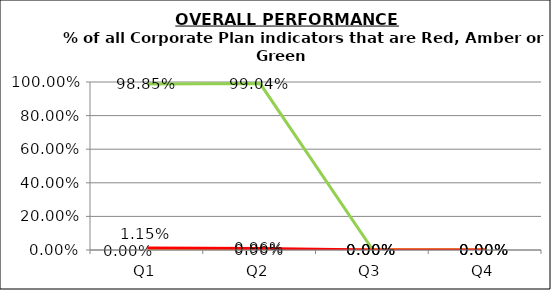
| Category | Green | Amber | Red |
|---|---|---|---|
| Q1 | 0.989 | 0 | 0.011 |
| Q2 | 0.99 | 0 | 0.01 |
| Q3 | 0 | 0 | 0 |
| Q4 | 0 | 0 | 0 |